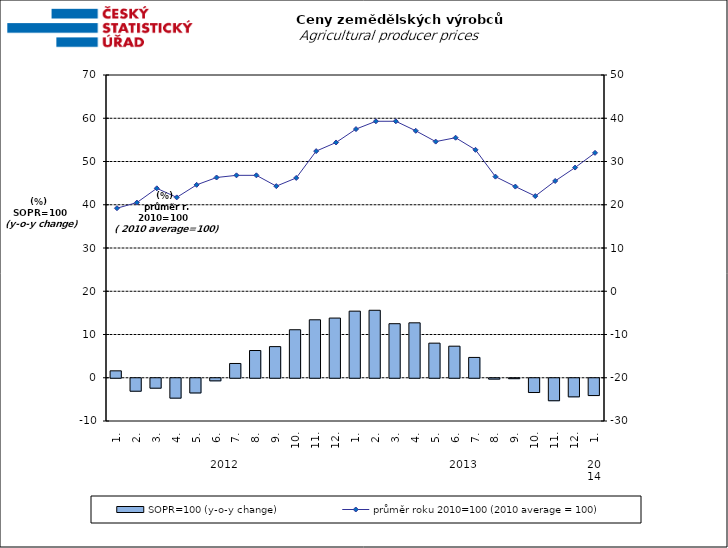
| Category | SOPR=100 (y-o-y change)   |
|---|---|
| 0 | 1.6 |
| 1 | -3 |
| 2 | -2.3 |
| 3 | -4.6 |
| 4 | -3.4 |
| 5 | -0.6 |
| 6 | 3.3 |
| 7 | 6.3 |
| 8 | 7.2 |
| 9 | 11.1 |
| 10 | 13.4 |
| 11 | 13.8 |
| 12 | 15.4 |
| 13 | 15.6 |
| 14 | 12.5 |
| 15 | 12.7 |
| 16 | 8 |
| 17 | 7.3 |
| 18 | 4.7 |
| 19 | -0.2 |
| 20 | -0.1 |
| 21 | -3.3 |
| 22 | -5.2 |
| 23 | -4.3 |
| 24 | -4 |